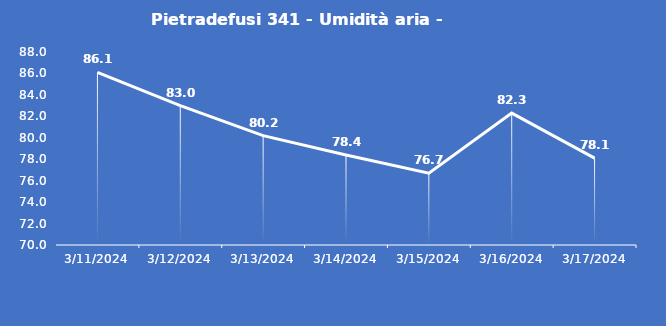
| Category | Pietradefusi 341 - Umidità aria - Grezzo (%) |
|---|---|
| 3/11/24 | 86.1 |
| 3/12/24 | 83 |
| 3/13/24 | 80.2 |
| 3/14/24 | 78.4 |
| 3/15/24 | 76.7 |
| 3/16/24 | 82.3 |
| 3/17/24 | 78.1 |